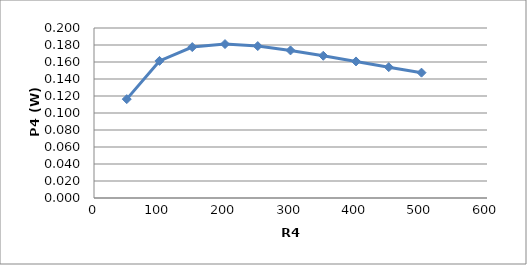
| Category | P4 |
|---|---|
| 50.0 | 0.116 |
| 100.0 | 0.161 |
| 150.0 | 0.178 |
| 200.0 | 0.181 |
| 250.0 | 0.179 |
| 300.0 | 0.174 |
| 350.0 | 0.167 |
| 400.0 | 0.161 |
| 450.0 | 0.154 |
| 500.0 | 0.147 |